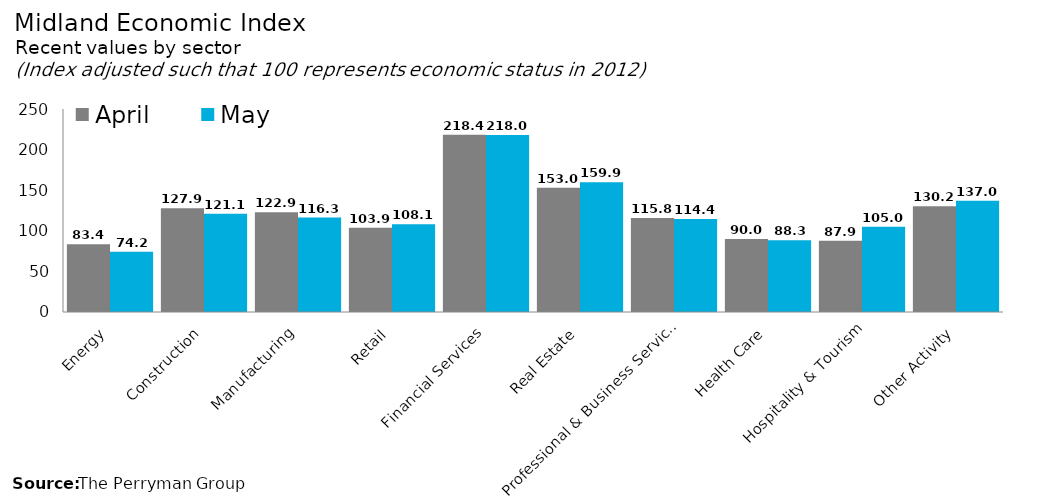
| Category | April | May |
|---|---|---|
| Energy | 83.357 | 74.239 |
| Construction | 127.895 | 121.054 |
| Manufacturing | 122.891 | 116.281 |
| Retail | 103.906 | 108.148 |
| Financial Services | 218.393 | 217.985 |
| Real Estate | 153.048 | 159.938 |
| Professional & Business Services | 115.838 | 114.446 |
| Health Care | 89.953 | 88.309 |
| Hospitality & Tourism | 87.896 | 105.022 |
| Other Activity | 130.211 | 136.985 |